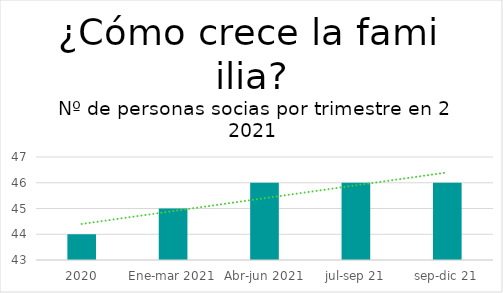
| Category | Series 1 |
|---|---|
| 2020 | 44 |
| Ene-mar 2021 | 45 |
| Abr-jun 2021 | 46 |
| jul-sep 21 | 46 |
| sep-dic 21 | 46 |